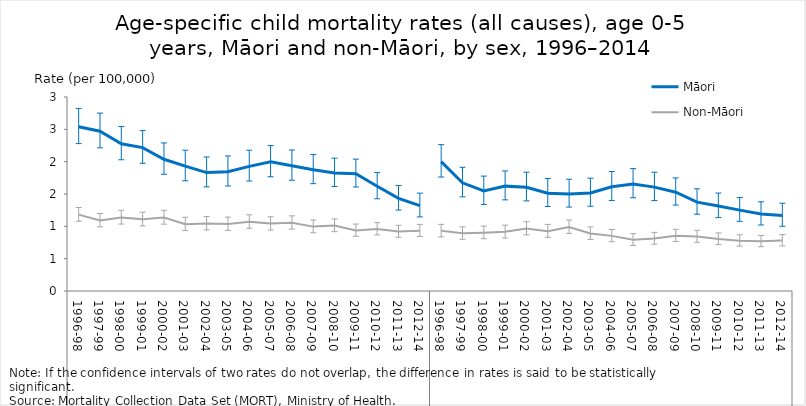
| Category | Māori | Non-Māori |
|---|---|---|
| 0 | 2.54 | 1.181 |
| 1 | 2.471 | 1.091 |
| 2 | 2.276 | 1.138 |
| 3 | 2.217 | 1.109 |
| 4 | 2.037 | 1.138 |
| 5 | 1.93 | 1.033 |
| 6 | 1.831 | 1.044 |
| 7 | 1.845 | 1.036 |
| 8 | 1.928 | 1.07 |
| 9 | 1.997 | 1.042 |
| 10 | 1.936 | 1.056 |
| 11 | 1.875 | 0.996 |
| 12 | 1.825 | 1.012 |
| 13 | 1.814 | 0.937 |
| 14 | 1.619 | 0.959 |
| 15 | 1.432 | 0.92 |
| 16 | 1.32 | 0.934 |
| 17 | 2.001 | 0.93 |
| 18 | 1.673 | 0.892 |
| 19 | 1.546 | 0.903 |
| 20 | 1.622 | 0.915 |
| 21 | 1.604 | 0.966 |
| 22 | 1.512 | 0.926 |
| 23 | 1.502 | 0.99 |
| 24 | 1.516 | 0.89 |
| 25 | 1.612 | 0.852 |
| 26 | 1.656 | 0.791 |
| 27 | 1.606 | 0.811 |
| 28 | 1.528 | 0.855 |
| 29 | 1.374 | 0.842 |
| 30 | 1.315 | 0.804 |
| 31 | 1.251 | 0.779 |
| 32 | 1.19 | 0.768 |
| 33 | 1.169 | 0.781 |